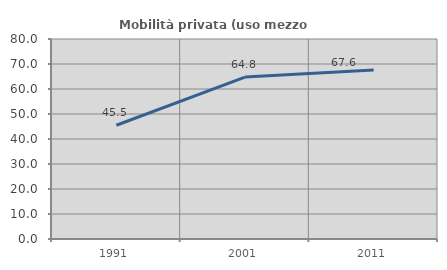
| Category | Mobilità privata (uso mezzo privato) |
|---|---|
| 1991.0 | 45.506 |
| 2001.0 | 64.754 |
| 2011.0 | 67.614 |